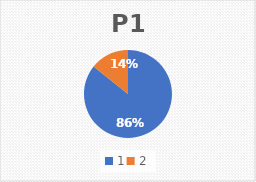
| Category | P1 |
|---|---|
| 0 | 24 |
| 1 | 4 |